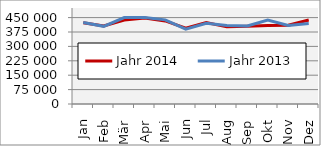
| Category | Jahr 2014 | Jahr 2013 |
|---|---|---|
| Jan | 422648 | 423974 |
| Feb | 406220 | 404557 |
| Mär | 437409 | 450143 |
| Apr | 448300 | 450941 |
| Mai | 432496 | 438169 |
| Jun | 394555 | 390215 |
| Jul | 424341 | 419905 |
| Aug | 401833 | 409022 |
| Sep | 405405 | 406320 |
| Okt | 409423 | 437531 |
| Nov | 410571 | 409114 |
| Dez | 437126 | 419380 |